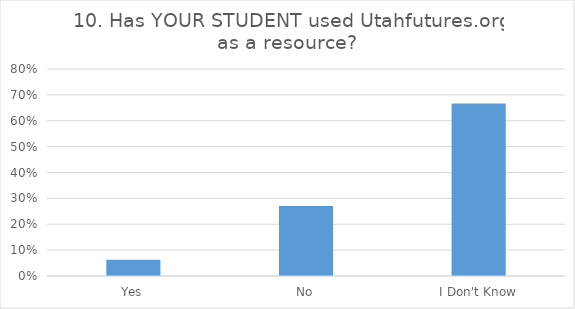
| Category | 10. Has YOUR STUDENT used Utahfutures.org as a resource?  |
|---|---|
| Yes | 0.062 |
| No | 0.271 |
| I Don't Know | 0.667 |